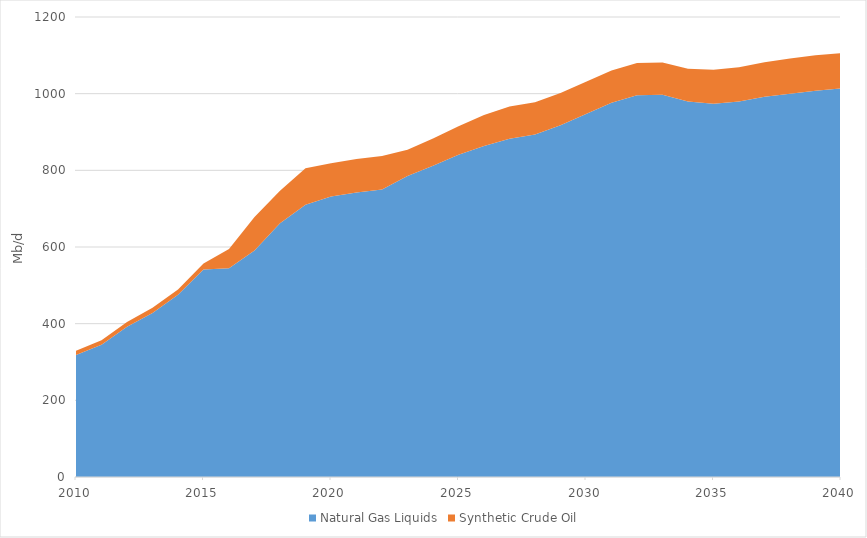
| Category | Natural Gas Liquids | Synthetic Crude Oil |
|---|---|---|
| 2010.0 | 317.968 | 11.077 |
| 2011.0 | 344.978 | 11.437 |
| 2012.0 | 391.772 | 12.451 |
| 2013.0 | 427.765 | 13.949 |
| 2014.0 | 475.448 | 13.785 |
| 2015.0 | 541.321 | 15.506 |
| 2016.0 | 544.244 | 50.478 |
| 2017.0 | 590.639 | 87.835 |
| 2018.0 | 662.204 | 84.683 |
| 2019.0 | 709.927 | 95.238 |
| 2020.0 | 731.782 | 87.002 |
| 2021.0 | 742.318 | 87.276 |
| 2022.0 | 750.323 | 87.276 |
| 2023.0 | 785.136 | 68.32 |
| 2024.0 | 811.717 | 71.195 |
| 2025.0 | 840.825 | 74.393 |
| 2026.0 | 863.581 | 80.47 |
| 2027.0 | 882.419 | 84.267 |
| 2028.0 | 893.287 | 84.046 |
| 2029.0 | 917.384 | 84.308 |
| 2030.0 | 946.982 | 84.308 |
| 2031.0 | 976.122 | 84.308 |
| 2032.0 | 995.687 | 84.046 |
| 2033.0 | 997.108 | 84.308 |
| 2034.0 | 979.422 | 85.579 |
| 2035.0 | 973.926 | 88.673 |
| 2036.0 | 979.819 | 89.052 |
| 2037.0 | 991.726 | 90.092 |
| 2038.0 | 999.967 | 91.949 |
| 2039.0 | 1007.91 | 92.343 |
| 2040.0 | 1013.476 | 92.054 |